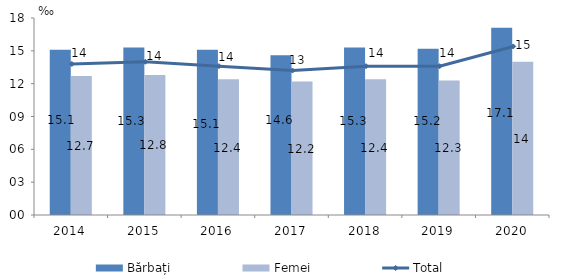
| Category | Bărbați | Femei |
|---|---|---|
| 2014.0 | 15.1 | 12.7 |
| 2015.0 | 15.3 | 12.8 |
| 2016.0 | 15.1 | 12.4 |
| 2017.0 | 14.6 | 12.2 |
| 2018.0 | 15.3 | 12.4 |
| 2019.0 | 15.2 | 12.3 |
| 2020.0 | 17.1 | 14 |